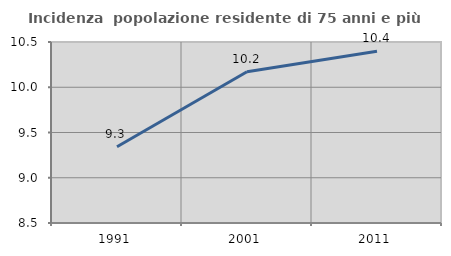
| Category | Incidenza  popolazione residente di 75 anni e più |
|---|---|
| 1991.0 | 9.343 |
| 2001.0 | 10.171 |
| 2011.0 | 10.397 |